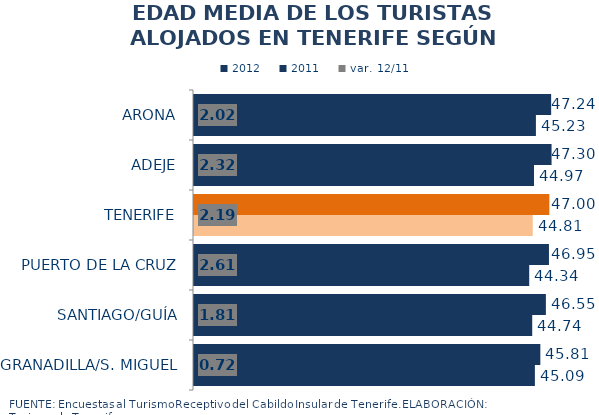
| Category | 2012 | 2011 |
|---|---|---|
| ARONA | 47.242 | 45.226 |
| ADEJE | 47.296 | 44.973 |
| TENERIFE | 47.002 | 44.81 |
| PUERTO DE LA CRUZ | 46.953 | 44.342 |
| SANTIAGO/GUÍA | 46.546 | 44.739 |
| GRANADILLA/S. MIGUEL | 45.814 | 45.092 |